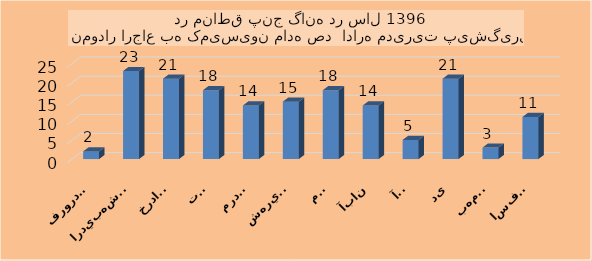
| Category | Series 0 |
|---|---|
| فروردين | 2 |
| ارديبهشت  | 23 |
| خرداد  | 21 |
| تير | 18 |
| مرداد | 14 |
| شهريور | 15 |
| مهر | 18 |
| آبان | 14 |
| آذر | 5 |
| دی | 21 |
| بهمن | 3 |
| اسفند | 11 |